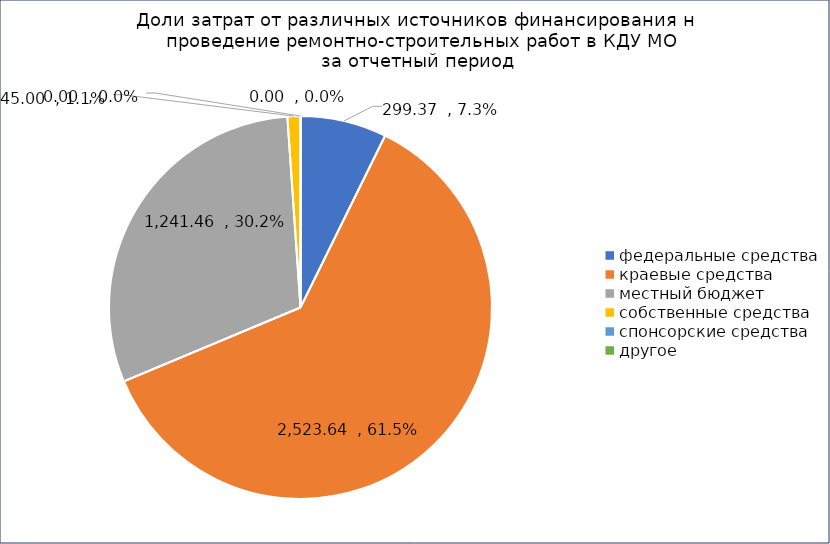
| Category | Series 2 |
|---|---|
| федеральные средства | 299.374 |
| краевые средства | 2523.641 |
| местный бюджет  | 1241.463 |
| собственные средства | 45 |
| спонсорские средства | 0 |
| другое | 0 |